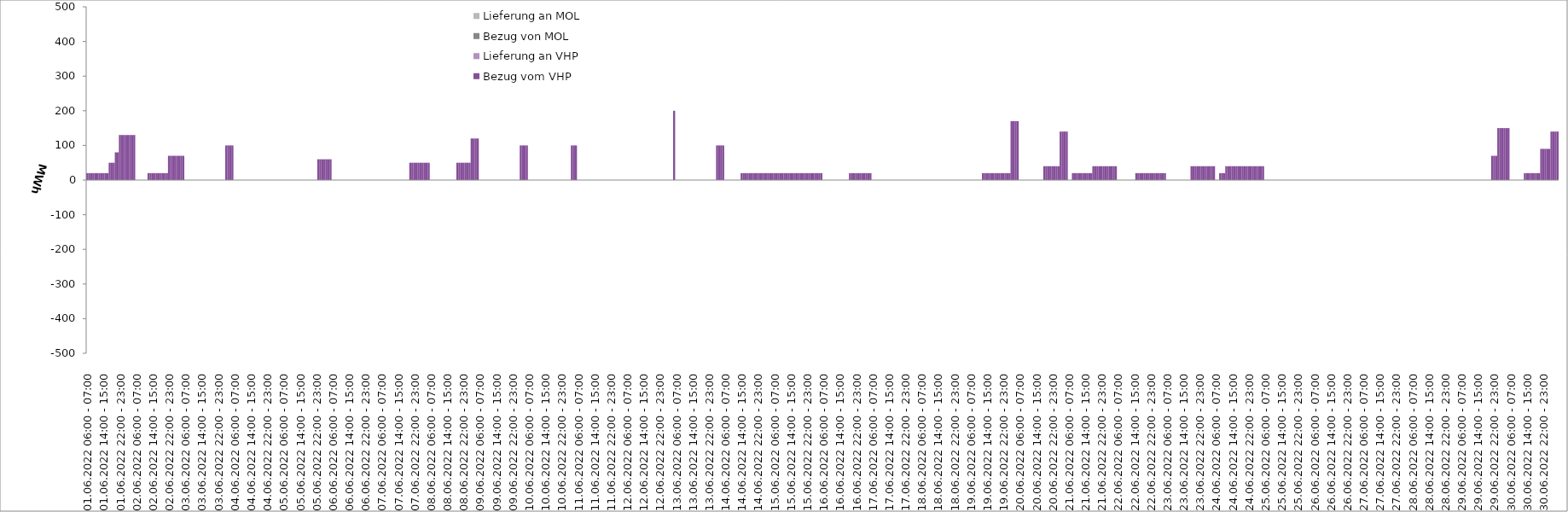
| Category | Bezug vom VHP | Lieferung an VHP | Bezug von MOL | Lieferung an MOL |
|---|---|---|---|---|
| 01.06.2022 06:00 - 07:00 | 20 | 0 | 0 | 0 |
| 01.06.2022 07:00 - 08:00 | 20 | 0 | 0 | 0 |
| 01.06.2022 08:00 - 09:00 | 20 | 0 | 0 | 0 |
| 01.06.2022 09:00 - 10:00 | 20 | 0 | 0 | 0 |
| 01.06.2022 10:00 - 11:00 | 20 | 0 | 0 | 0 |
| 01.06.2022 11:00 - 12:00 | 20 | 0 | 0 | 0 |
| 01.06.2022 12:00 - 13:00 | 20 | 0 | 0 | 0 |
| 01.06.2022 13:00 - 14:00 | 20 | 0 | 0 | 0 |
| 01.06.2022 14:00 - 15:00 | 20 | 0 | 0 | 0 |
| 01.06.2022 15:00 - 16:00 | 20 | 0 | 0 | 0 |
| 01.06.2022 16:00 - 17:00 | 20 | 0 | 0 | 0 |
| 01.06.2022 17:00 - 18:00 | 50 | 0 | 0 | 0 |
| 01.06.2022 18:00 - 19:00 | 50 | 0 | 0 | 0 |
| 01.06.2022 19:00 - 20:00 | 50 | 0 | 0 | 0 |
| 01.06.2022 20:00 - 21:00 | 80 | 0 | 0 | 0 |
| 01.06.2022 21:00 - 22:00 | 80 | 0 | 0 | 0 |
| 01.06.2022 22:00 - 23:00 | 130 | 0 | 0 | 0 |
| 01.06.2022 23:00 - 24:00 | 130 | 0 | 0 | 0 |
| 02.06.2022 00:00 - 01:00 | 130 | 0 | 0 | 0 |
| 02.06.2022 01:00 - 02:00 | 130 | 0 | 0 | 0 |
| 02.06.2022 02:00 - 03:00 | 130 | 0 | 0 | 0 |
| 02.06.2022 03:00 - 04:00 | 130 | 0 | 0 | 0 |
| 02.06.2022 04:00 - 05:00 | 130 | 0 | 0 | 0 |
| 02.06.2022 05:00 - 06:00 | 130 | 0 | 0 | 0 |
| 02.06.2022 06:00 - 07:00 | 0 | 0 | 0 | 0 |
| 02.06.2022 07:00 - 08:00 | 0 | 0 | 0 | 0 |
| 02.06.2022 08:00 - 09:00 | 0 | 0 | 0 | 0 |
| 02.06.2022 09:00 - 10:00 | 0 | 0 | 0 | 0 |
| 02.06.2022 10:00 - 11:00 | 0 | 0 | 0 | 0 |
| 02.06.2022 11:00 - 12:00 | 0 | 0 | 0 | 0 |
| 02.06.2022 12:00 - 13:00 | 20 | 0 | 0 | 0 |
| 02.06.2022 13:00 - 14:00 | 20 | 0 | 0 | 0 |
| 02.06.2022 14:00 - 15:00 | 20 | 0 | 0 | 0 |
| 02.06.2022 15:00 - 16:00 | 20 | 0 | 0 | 0 |
| 02.06.2022 16:00 - 17:00 | 20 | 0 | 0 | 0 |
| 02.06.2022 17:00 - 18:00 | 20 | 0 | 0 | 0 |
| 02.06.2022 18:00 - 19:00 | 20 | 0 | 0 | 0 |
| 02.06.2022 19:00 - 20:00 | 20 | 0 | 0 | 0 |
| 02.06.2022 20:00 - 21:00 | 20 | 0 | 0 | 0 |
| 02.06.2022 21:00 - 22:00 | 20 | 0 | 0 | 0 |
| 02.06.2022 22:00 - 23:00 | 70 | 0 | 0 | 0 |
| 02.06.2022 23:00 - 24:00 | 70 | 0 | 0 | 0 |
| 03.06.2022 00:00 - 01:00 | 70 | 0 | 0 | 0 |
| 03.06.2022 01:00 - 02:00 | 70 | 0 | 0 | 0 |
| 03.06.2022 02:00 - 03:00 | 70 | 0 | 0 | 0 |
| 03.06.2022 03:00 - 04:00 | 70 | 0 | 0 | 0 |
| 03.06.2022 04:00 - 05:00 | 70 | 0 | 0 | 0 |
| 03.06.2022 05:00 - 06:00 | 70 | 0 | 0 | 0 |
| 03.06.2022 06:00 - 07:00 | 0 | 0 | 0 | 0 |
| 03.06.2022 07:00 - 08:00 | 0 | 0 | 0 | 0 |
| 03.06.2022 08:00 - 09:00 | 0 | 0 | 0 | 0 |
| 03.06.2022 09:00 - 10:00 | 0 | 0 | 0 | 0 |
| 03.06.2022 10:00 - 11:00 | 0 | 0 | 0 | 0 |
| 03.06.2022 11:00 - 12:00 | 0 | 0 | 0 | 0 |
| 03.06.2022 12:00 - 13:00 | 0 | 0 | 0 | 0 |
| 03.06.2022 13:00 - 14:00 | 0 | 0 | 0 | 0 |
| 03.06.2022 14:00 - 15:00 | 0 | 0 | 0 | 0 |
| 03.06.2022 15:00 - 16:00 | 0 | 0 | 0 | 0 |
| 03.06.2022 16:00 - 17:00 | 0 | 0 | 0 | 0 |
| 03.06.2022 17:00 - 18:00 | 0 | 0 | 0 | 0 |
| 03.06.2022 18:00 - 19:00 | 0 | 0 | 0 | 0 |
| 03.06.2022 19:00 - 20:00 | 0 | 0 | 0 | 0 |
| 03.06.2022 20:00 - 21:00 | 0 | 0 | 0 | 0 |
| 03.06.2022 21:00 - 22:00 | 0 | 0 | 0 | 0 |
| 03.06.2022 22:00 - 23:00 | 0 | 0 | 0 | 0 |
| 03.06.2022 23:00 - 24:00 | 0 | 0 | 0 | 0 |
| 04.06.2022 00:00 - 01:00 | 0 | 0 | 0 | 0 |
| 04.06.2022 01:00 - 02:00 | 0 | 0 | 0 | 0 |
| 04.06.2022 02:00 - 03:00 | 100 | 0 | 0 | 0 |
| 04.06.2022 03:00 - 04:00 | 100 | 0 | 0 | 0 |
| 04.06.2022 04:00 - 05:00 | 100 | 0 | 0 | 0 |
| 04.06.2022 05:00 - 06:00 | 100 | 0 | 0 | 0 |
| 04.06.2022 06:00 - 07:00 | 0 | 0 | 0 | 0 |
| 04.06.2022 07:00 - 08:00 | 0 | 0 | 0 | 0 |
| 04.06.2022 08:00 - 09:00 | 0 | 0 | 0 | 0 |
| 04.06.2022 09:00 - 10:00 | 0 | 0 | 0 | 0 |
| 04.06.2022 10:00 - 11:00 | 0 | 0 | 0 | 0 |
| 04.06.2022 11:00 - 12:00 | 0 | 0 | 0 | 0 |
| 04.06.2022 12:00 - 13:00 | 0 | 0 | 0 | 0 |
| 04.06.2022 13:00 - 14:00 | 0 | 0 | 0 | 0 |
| 04.06.2022 14:00 - 15:00 | 0 | 0 | 0 | 0 |
| 04.06.2022 15:00 - 16:00 | 0 | 0 | 0 | 0 |
| 04.06.2022 16:00 - 17:00 | 0 | 0 | 0 | 0 |
| 04.06.2022 17:00 - 18:00 | 0 | 0 | 0 | 0 |
| 04.06.2022 18:00 - 19:00 | 0 | 0 | 0 | 0 |
| 04.06.2022 19:00 - 20:00 | 0 | 0 | 0 | 0 |
| 04.06.2022 20:00 - 21:00 | 0 | 0 | 0 | 0 |
| 04.06.2022 21:00 - 22:00 | 0 | 0 | 0 | 0 |
| 04.06.2022 22:00 - 23:00 | 0 | 0 | 0 | 0 |
| 04.06.2022 23:00 - 24:00 | 0 | 0 | 0 | 0 |
| 05.06.2022 00:00 - 01:00 | 0 | 0 | 0 | 0 |
| 05.06.2022 01:00 - 02:00 | 0 | 0 | 0 | 0 |
| 05.06.2022 02:00 - 03:00 | 0 | 0 | 0 | 0 |
| 05.06.2022 03:00 - 04:00 | 0 | 0 | 0 | 0 |
| 05.06.2022 04:00 - 05:00 | 0 | 0 | 0 | 0 |
| 05.06.2022 05:00 - 06:00 | 0 | 0 | 0 | 0 |
| 05.06.2022 06:00 - 07:00 | 0 | 0 | 0 | 0 |
| 05.06.2022 07:00 - 08:00 | 0 | 0 | 0 | 0 |
| 05.06.2022 08:00 - 09:00 | 0 | 0 | 0 | 0 |
| 05.06.2022 09:00 - 10:00 | 0 | 0 | 0 | 0 |
| 05.06.2022 10:00 - 11:00 | 0 | 0 | 0 | 0 |
| 05.06.2022 11:00 - 12:00 | 0 | 0 | 0 | 0 |
| 05.06.2022 12:00 - 13:00 | 0 | 0 | 0 | 0 |
| 05.06.2022 13:00 - 14:00 | 0 | 0 | 0 | 0 |
| 05.06.2022 14:00 - 15:00 | 0 | 0 | 0 | 0 |
| 05.06.2022 15:00 - 16:00 | 0 | 0 | 0 | 0 |
| 05.06.2022 16:00 - 17:00 | 0 | 0 | 0 | 0 |
| 05.06.2022 17:00 - 18:00 | 0 | 0 | 0 | 0 |
| 05.06.2022 18:00 - 19:00 | 0 | 0 | 0 | 0 |
| 05.06.2022 19:00 - 20:00 | 0 | 0 | 0 | 0 |
| 05.06.2022 20:00 - 21:00 | 0 | 0 | 0 | 0 |
| 05.06.2022 21:00 - 22:00 | 0 | 0 | 0 | 0 |
| 05.06.2022 22:00 - 23:00 | 0 | 0 | 0 | 0 |
| 05.06.2022 23:00 - 24:00 | 60 | 0 | 0 | 0 |
| 06.06.2022 00:00 - 01:00 | 60 | 0 | 0 | 0 |
| 06.06.2022 01:00 - 02:00 | 60 | 0 | 0 | 0 |
| 06.06.2022 02:00 - 03:00 | 60 | 0 | 0 | 0 |
| 06.06.2022 03:00 - 04:00 | 60 | 0 | 0 | 0 |
| 06.06.2022 04:00 - 05:00 | 60 | 0 | 0 | 0 |
| 06.06.2022 05:00 - 06:00 | 60 | 0 | 0 | 0 |
| 06.06.2022 06:00 - 07:00 | 0 | 0 | 0 | 0 |
| 06.06.2022 07:00 - 08:00 | 0 | 0 | 0 | 0 |
| 06.06.2022 08:00 - 09:00 | 0 | 0 | 0 | 0 |
| 06.06.2022 09:00 - 10:00 | 0 | 0 | 0 | 0 |
| 06.06.2022 10:00 - 11:00 | 0 | 0 | 0 | 0 |
| 06.06.2022 11:00 - 12:00 | 0 | 0 | 0 | 0 |
| 06.06.2022 12:00 - 13:00 | 0 | 0 | 0 | 0 |
| 06.06.2022 13:00 - 14:00 | 0 | 0 | 0 | 0 |
| 06.06.2022 14:00 - 15:00 | 0 | 0 | 0 | 0 |
| 06.06.2022 15:00 - 16:00 | 0 | 0 | 0 | 0 |
| 06.06.2022 16:00 - 17:00 | 0 | 0 | 0 | 0 |
| 06.06.2022 17:00 - 18:00 | 0 | 0 | 0 | 0 |
| 06.06.2022 18:00 - 19:00 | 0 | 0 | 0 | 0 |
| 06.06.2022 19:00 - 20:00 | 0 | 0 | 0 | 0 |
| 06.06.2022 20:00 - 21:00 | 0 | 0 | 0 | 0 |
| 06.06.2022 21:00 - 22:00 | 0 | 0 | 0 | 0 |
| 06.06.2022 22:00 - 23:00 | 0 | 0 | 0 | 0 |
| 06.06.2022 23:00 - 24:00 | 0 | 0 | 0 | 0 |
| 07.06.2022 00:00 - 01:00 | 0 | 0 | 0 | 0 |
| 07.06.2022 01:00 - 02:00 | 0 | 0 | 0 | 0 |
| 07.06.2022 02:00 - 03:00 | 0 | 0 | 0 | 0 |
| 07.06.2022 03:00 - 04:00 | 0 | 0 | 0 | 0 |
| 07.06.2022 04:00 - 05:00 | 0 | 0 | 0 | 0 |
| 07.06.2022 05:00 - 06:00 | 0 | 0 | 0 | 0 |
| 07.06.2022 06:00 - 07:00 | 0 | 0 | 0 | 0 |
| 07.06.2022 07:00 - 08:00 | 0 | 0 | 0 | 0 |
| 07.06.2022 08:00 - 09:00 | 0 | 0 | 0 | 0 |
| 07.06.2022 09:00 - 10:00 | 0 | 0 | 0 | 0 |
| 07.06.2022 10:00 - 11:00 | 0 | 0 | 0 | 0 |
| 07.06.2022 11:00 - 12:00 | 0 | 0 | 0 | 0 |
| 07.06.2022 12:00 - 13:00 | 0 | 0 | 0 | 0 |
| 07.06.2022 13:00 - 14:00 | 0 | 0 | 0 | 0 |
| 07.06.2022 14:00 - 15:00 | 0 | 0 | 0 | 0 |
| 07.06.2022 15:00 - 16:00 | 0 | 0 | 0 | 0 |
| 07.06.2022 16:00 - 17:00 | 0 | 0 | 0 | 0 |
| 07.06.2022 17:00 - 18:00 | 0 | 0 | 0 | 0 |
| 07.06.2022 18:00 - 19:00 | 0 | 0 | 0 | 0 |
| 07.06.2022 19:00 - 20:00 | 0 | 0 | 0 | 0 |
| 07.06.2022 20:00 - 21:00 | 50 | 0 | 0 | 0 |
| 07.06.2022 21:00 - 22:00 | 50 | 0 | 0 | 0 |
| 07.06.2022 22:00 - 23:00 | 50 | 0 | 0 | 0 |
| 07.06.2022 23:00 - 24:00 | 50 | 0 | 0 | 0 |
| 08.06.2022 00:00 - 01:00 | 50 | 0 | 0 | 0 |
| 08.06.2022 01:00 - 02:00 | 50 | 0 | 0 | 0 |
| 08.06.2022 02:00 - 03:00 | 50 | 0 | 0 | 0 |
| 08.06.2022 03:00 - 04:00 | 50 | 0 | 0 | 0 |
| 08.06.2022 04:00 - 05:00 | 50 | 0 | 0 | 0 |
| 08.06.2022 05:00 - 06:00 | 50 | 0 | 0 | 0 |
| 08.06.2022 06:00 - 07:00 | 0 | 0 | 0 | 0 |
| 08.06.2022 07:00 - 08:00 | 0 | 0 | 0 | 0 |
| 08.06.2022 08:00 - 09:00 | 0 | 0 | 0 | 0 |
| 08.06.2022 09:00 - 10:00 | 0 | 0 | 0 | 0 |
| 08.06.2022 10:00 - 11:00 | 0 | 0 | 0 | 0 |
| 08.06.2022 11:00 - 12:00 | 0 | 0 | 0 | 0 |
| 08.06.2022 12:00 - 13:00 | 0 | 0 | 0 | 0 |
| 08.06.2022 13:00 - 14:00 | 0 | 0 | 0 | 0 |
| 08.06.2022 14:00 - 15:00 | 0 | 0 | 0 | 0 |
| 08.06.2022 15:00 - 16:00 | 0 | 0 | 0 | 0 |
| 08.06.2022 16:00 - 17:00 | 0 | 0 | 0 | 0 |
| 08.06.2022 17:00 - 18:00 | 0 | 0 | 0 | 0 |
| 08.06.2022 18:00 - 19:00 | 0 | 0 | 0 | 0 |
| 08.06.2022 19:00 - 20:00 | 50 | 0 | 0 | 0 |
| 08.06.2022 20:00 - 21:00 | 50 | 0 | 0 | 0 |
| 08.06.2022 21:00 - 22:00 | 50 | 0 | 0 | 0 |
| 08.06.2022 22:00 - 23:00 | 50 | 0 | 0 | 0 |
| 08.06.2022 23:00 - 24:00 | 50 | 0 | 0 | 0 |
| 09.06.2022 00:00 - 01:00 | 50 | 0 | 0 | 0 |
| 09.06.2022 01:00 - 02:00 | 50 | 0 | 0 | 0 |
| 09.06.2022 02:00 - 03:00 | 120 | 0 | 0 | 0 |
| 09.06.2022 03:00 - 04:00 | 120 | 0 | 0 | 0 |
| 09.06.2022 04:00 - 05:00 | 120 | 0 | 0 | 0 |
| 09.06.2022 05:00 - 06:00 | 120 | 0 | 0 | 0 |
| 09.06.2022 06:00 - 07:00 | 0 | 0 | 0 | 0 |
| 09.06.2022 07:00 - 08:00 | 0 | 0 | 0 | 0 |
| 09.06.2022 08:00 - 09:00 | 0 | 0 | 0 | 0 |
| 09.06.2022 09:00 - 10:00 | 0 | 0 | 0 | 0 |
| 09.06.2022 10:00 - 11:00 | 0 | 0 | 0 | 0 |
| 09.06.2022 11:00 - 12:00 | 0 | 0 | 0 | 0 |
| 09.06.2022 12:00 - 13:00 | 0 | 0 | 0 | 0 |
| 09.06.2022 13:00 - 14:00 | 0 | 0 | 0 | 0 |
| 09.06.2022 14:00 - 15:00 | 0 | 0 | 0 | 0 |
| 09.06.2022 15:00 - 16:00 | 0 | 0 | 0 | 0 |
| 09.06.2022 16:00 - 17:00 | 0 | 0 | 0 | 0 |
| 09.06.2022 17:00 - 18:00 | 0 | 0 | 0 | 0 |
| 09.06.2022 18:00 - 19:00 | 0 | 0 | 0 | 0 |
| 09.06.2022 19:00 - 20:00 | 0 | 0 | 0 | 0 |
| 09.06.2022 20:00 - 21:00 | 0 | 0 | 0 | 0 |
| 09.06.2022 21:00 - 22:00 | 0 | 0 | 0 | 0 |
| 09.06.2022 22:00 - 23:00 | 0 | 0 | 0 | 0 |
| 09.06.2022 23:00 - 24:00 | 0 | 0 | 0 | 0 |
| 10.06.2022 00:00 - 01:00 | 0 | 0 | 0 | 0 |
| 10.06.2022 01:00 - 02:00 | 0 | 0 | 0 | 0 |
| 10.06.2022 02:00 - 03:00 | 100 | 0 | 0 | 0 |
| 10.06.2022 03:00 - 04:00 | 100 | 0 | 0 | 0 |
| 10.06.2022 04:00 - 05:00 | 100 | 0 | 0 | 0 |
| 10.06.2022 05:00 - 06:00 | 100 | 0 | 0 | 0 |
| 10.06.2022 06:00 - 07:00 | 0 | 0 | 0 | 0 |
| 10.06.2022 07:00 - 08:00 | 0 | 0 | 0 | 0 |
| 10.06.2022 08:00 - 09:00 | 0 | 0 | 0 | 0 |
| 10.06.2022 09:00 - 10:00 | 0 | 0 | 0 | 0 |
| 10.06.2022 10:00 - 11:00 | 0 | 0 | 0 | 0 |
| 10.06.2022 11:00 - 12:00 | 0 | 0 | 0 | 0 |
| 10.06.2022 12:00 - 13:00 | 0 | 0 | 0 | 0 |
| 10.06.2022 13:00 - 14:00 | 0 | 0 | 0 | 0 |
| 10.06.2022 14:00 - 15:00 | 0 | 0 | 0 | 0 |
| 10.06.2022 15:00 - 16:00 | 0 | 0 | 0 | 0 |
| 10.06.2022 16:00 - 17:00 | 0 | 0 | 0 | 0 |
| 10.06.2022 17:00 - 18:00 | 0 | 0 | 0 | 0 |
| 10.06.2022 18:00 - 19:00 | 0 | 0 | 0 | 0 |
| 10.06.2022 19:00 - 20:00 | 0 | 0 | 0 | 0 |
| 10.06.2022 20:00 - 21:00 | 0 | 0 | 0 | 0 |
| 10.06.2022 21:00 - 22:00 | 0 | 0 | 0 | 0 |
| 10.06.2022 22:00 - 23:00 | 0 | 0 | 0 | 0 |
| 10.06.2022 23:00 - 24:00 | 0 | 0 | 0 | 0 |
| 11.06.2022 00:00 - 01:00 | 0 | 0 | 0 | 0 |
| 11.06.2022 01:00 - 02:00 | 0 | 0 | 0 | 0 |
| 11.06.2022 02:00 - 03:00 | 0 | 0 | 0 | 0 |
| 11.06.2022 03:00 - 04:00 | 100 | 0 | 0 | 0 |
| 11.06.2022 04:00 - 05:00 | 100 | 0 | 0 | 0 |
| 11.06.2022 05:00 - 06:00 | 100 | 0 | 0 | 0 |
| 11.06.2022 06:00 - 07:00 | 0 | 0 | 0 | 0 |
| 11.06.2022 07:00 - 08:00 | 0 | 0 | 0 | 0 |
| 11.06.2022 08:00 - 09:00 | 0 | 0 | 0 | 0 |
| 11.06.2022 09:00 - 10:00 | 0 | 0 | 0 | 0 |
| 11.06.2022 10:00 - 11:00 | 0 | 0 | 0 | 0 |
| 11.06.2022 11:00 - 12:00 | 0 | 0 | 0 | 0 |
| 11.06.2022 12:00 - 13:00 | 0 | 0 | 0 | 0 |
| 11.06.2022 13:00 - 14:00 | 0 | 0 | 0 | 0 |
| 11.06.2022 14:00 - 15:00 | 0 | 0 | 0 | 0 |
| 11.06.2022 15:00 - 16:00 | 0 | 0 | 0 | 0 |
| 11.06.2022 16:00 - 17:00 | 0 | 0 | 0 | 0 |
| 11.06.2022 17:00 - 18:00 | 0 | 0 | 0 | 0 |
| 11.06.2022 18:00 - 19:00 | 0 | 0 | 0 | 0 |
| 11.06.2022 19:00 - 20:00 | 0 | 0 | 0 | 0 |
| 11.06.2022 20:00 - 21:00 | 0 | 0 | 0 | 0 |
| 11.06.2022 21:00 - 22:00 | 0 | 0 | 0 | 0 |
| 11.06.2022 22:00 - 23:00 | 0 | 0 | 0 | 0 |
| 11.06.2022 23:00 - 24:00 | 0 | 0 | 0 | 0 |
| 12.06.2022 00:00 - 01:00 | 0 | 0 | 0 | 0 |
| 12.06.2022 01:00 - 02:00 | 0 | 0 | 0 | 0 |
| 12.06.2022 02:00 - 03:00 | 0 | 0 | 0 | 0 |
| 12.06.2022 03:00 - 04:00 | 0 | 0 | 0 | 0 |
| 12.06.2022 04:00 - 05:00 | 0 | 0 | 0 | 0 |
| 12.06.2022 05:00 - 06:00 | 0 | 0 | 0 | 0 |
| 12.06.2022 06:00 - 07:00 | 0 | 0 | 0 | 0 |
| 12.06.2022 07:00 - 08:00 | 0 | 0 | 0 | 0 |
| 12.06.2022 08:00 - 09:00 | 0 | 0 | 0 | 0 |
| 12.06.2022 09:00 - 10:00 | 0 | 0 | 0 | 0 |
| 12.06.2022 10:00 - 11:00 | 0 | 0 | 0 | 0 |
| 12.06.2022 11:00 - 12:00 | 0 | 0 | 0 | 0 |
| 12.06.2022 12:00 - 13:00 | 0 | 0 | 0 | 0 |
| 12.06.2022 13:00 - 14:00 | 0 | 0 | 0 | 0 |
| 12.06.2022 14:00 - 15:00 | 0 | 0 | 0 | 0 |
| 12.06.2022 15:00 - 16:00 | 0 | 0 | 0 | 0 |
| 12.06.2022 16:00 - 17:00 | 0 | 0 | 0 | 0 |
| 12.06.2022 17:00 - 18:00 | 0 | 0 | 0 | 0 |
| 12.06.2022 18:00 - 19:00 | 0 | 0 | 0 | 0 |
| 12.06.2022 19:00 - 20:00 | 0 | 0 | 0 | 0 |
| 12.06.2022 20:00 - 21:00 | 0 | 0 | 0 | 0 |
| 12.06.2022 21:00 - 22:00 | 0 | 0 | 0 | 0 |
| 12.06.2022 22:00 - 23:00 | 0 | 0 | 0 | 0 |
| 12.06.2022 23:00 - 24:00 | 0 | 0 | 0 | 0 |
| 13.06.2022 00:00 - 01:00 | 0 | 0 | 0 | 0 |
| 13.06.2022 01:00 - 02:00 | 0 | 0 | 0 | 0 |
| 13.06.2022 02:00 - 03:00 | 0 | 0 | 0 | 0 |
| 13.06.2022 03:00 - 04:00 | 0 | 0 | 0 | 0 |
| 13.06.2022 04:00 - 05:00 | 0 | 0 | 0 | 0 |
| 13.06.2022 05:00 - 06:00 | 200 | 0 | 0 | 0 |
| 13.06.2022 06:00 - 07:00 | 0 | 0 | 0 | 0 |
| 13.06.2022 07:00 - 08:00 | 0 | 0 | 0 | 0 |
| 13.06.2022 08:00 - 09:00 | 0 | 0 | 0 | 0 |
| 13.06.2022 09:00 - 10:00 | 0 | 0 | 0 | 0 |
| 13.06.2022 10:00 - 11:00 | 0 | 0 | 0 | 0 |
| 13.06.2022 11:00 - 12:00 | 0 | 0 | 0 | 0 |
| 13.06.2022 12:00 - 13:00 | 0 | 0 | 0 | 0 |
| 13.06.2022 13:00 - 14:00 | 0 | 0 | 0 | 0 |
| 13.06.2022 14:00 - 15:00 | 0 | 0 | 0 | 0 |
| 13.06.2022 15:00 - 16:00 | 0 | 0 | 0 | 0 |
| 13.06.2022 16:00 - 17:00 | 0 | 0 | 0 | 0 |
| 13.06.2022 17:00 - 18:00 | 0 | 0 | 0 | 0 |
| 13.06.2022 18:00 - 19:00 | 0 | 0 | 0 | 0 |
| 13.06.2022 19:00 - 20:00 | 0 | 0 | 0 | 0 |
| 13.06.2022 20:00 - 21:00 | 0 | 0 | 0 | 0 |
| 13.06.2022 21:00 - 22:00 | 0 | 0 | 0 | 0 |
| 13.06.2022 22:00 - 23:00 | 0 | 0 | 0 | 0 |
| 13.06.2022 23:00 - 24:00 | 0 | 0 | 0 | 0 |
| 14.06.2022 00:00 - 01:00 | 0 | 0 | 0 | 0 |
| 14.06.2022 01:00 - 02:00 | 0 | 0 | 0 | 0 |
| 14.06.2022 02:00 - 03:00 | 100 | 0 | 0 | 0 |
| 14.06.2022 03:00 - 04:00 | 100 | 0 | 0 | 0 |
| 14.06.2022 04:00 - 05:00 | 100 | 0 | 0 | 0 |
| 14.06.2022 05:00 - 06:00 | 100 | 0 | 0 | 0 |
| 14.06.2022 06:00 - 07:00 | 0 | 0 | 0 | 0 |
| 14.06.2022 07:00 - 08:00 | 0 | 0 | 0 | 0 |
| 14.06.2022 08:00 - 09:00 | 0 | 0 | 0 | 0 |
| 14.06.2022 09:00 - 10:00 | 0 | 0 | 0 | 0 |
| 14.06.2022 10:00 - 11:00 | 0 | 0 | 0 | 0 |
| 14.06.2022 11:00 - 12:00 | 0 | 0 | 0 | 0 |
| 14.06.2022 12:00 - 13:00 | 0 | 0 | 0 | 0 |
| 14.06.2022 13:00 - 14:00 | 0 | 0 | 0 | 0 |
| 14.06.2022 14:00 - 15:00 | 20 | 0 | 0 | 0 |
| 14.06.2022 15:00 - 16:00 | 20 | 0 | 0 | 0 |
| 14.06.2022 16:00 - 17:00 | 20 | 0 | 0 | 0 |
| 14.06.2022 17:00 - 18:00 | 20 | 0 | 0 | 0 |
| 14.06.2022 18:00 - 19:00 | 20 | 0 | 0 | 0 |
| 14.06.2022 19:00 - 20:00 | 20 | 0 | 0 | 0 |
| 14.06.2022 20:00 - 21:00 | 20 | 0 | 0 | 0 |
| 14.06.2022 21:00 - 22:00 | 20 | 0 | 0 | 0 |
| 14.06.2022 22:00 - 23:00 | 20 | 0 | 0 | 0 |
| 14.06.2022 23:00 - 24:00 | 20 | 0 | 0 | 0 |
| 15.06.2022 00:00 - 01:00 | 20 | 0 | 0 | 0 |
| 15.06.2022 01:00 - 02:00 | 20 | 0 | 0 | 0 |
| 15.06.2022 02:00 - 03:00 | 20 | 0 | 0 | 0 |
| 15.06.2022 03:00 - 04:00 | 20 | 0 | 0 | 0 |
| 15.06.2022 04:00 - 05:00 | 20 | 0 | 0 | 0 |
| 15.06.2022 05:00 - 06:00 | 20 | 0 | 0 | 0 |
| 15.06.2022 06:00 - 07:00 | 20 | 0 | 0 | 0 |
| 15.06.2022 07:00 - 08:00 | 20 | 0 | 0 | 0 |
| 15.06.2022 08:00 - 09:00 | 20 | 0 | 0 | 0 |
| 15.06.2022 09:00 - 10:00 | 20 | 0 | 0 | 0 |
| 15.06.2022 10:00 - 11:00 | 20 | 0 | 0 | 0 |
| 15.06.2022 11:00 - 12:00 | 20 | 0 | 0 | 0 |
| 15.06.2022 12:00 - 13:00 | 20 | 0 | 0 | 0 |
| 15.06.2022 13:00 - 14:00 | 20 | 0 | 0 | 0 |
| 15.06.2022 14:00 - 15:00 | 20 | 0 | 0 | 0 |
| 15.06.2022 15:00 - 16:00 | 20 | 0 | 0 | 0 |
| 15.06.2022 16:00 - 17:00 | 20 | 0 | 0 | 0 |
| 15.06.2022 17:00 - 18:00 | 20 | 0 | 0 | 0 |
| 15.06.2022 18:00 - 19:00 | 20 | 0 | 0 | 0 |
| 15.06.2022 19:00 - 20:00 | 20 | 0 | 0 | 0 |
| 15.06.2022 20:00 - 21:00 | 20 | 0 | 0 | 0 |
| 15.06.2022 21:00 - 22:00 | 20 | 0 | 0 | 0 |
| 15.06.2022 22:00 - 23:00 | 20 | 0 | 0 | 0 |
| 15.06.2022 23:00 - 24:00 | 20 | 0 | 0 | 0 |
| 16.06.2022 00:00 - 01:00 | 20 | 0 | 0 | 0 |
| 16.06.2022 01:00 - 02:00 | 20 | 0 | 0 | 0 |
| 16.06.2022 02:00 - 03:00 | 20 | 0 | 0 | 0 |
| 16.06.2022 03:00 - 04:00 | 20 | 0 | 0 | 0 |
| 16.06.2022 04:00 - 05:00 | 20 | 0 | 0 | 0 |
| 16.06.2022 05:00 - 06:00 | 20 | 0 | 0 | 0 |
| 16.06.2022 06:00 - 07:00 | 0 | 0 | 0 | 0 |
| 16.06.2022 07:00 - 08:00 | 0 | 0 | 0 | 0 |
| 16.06.2022 08:00 - 09:00 | 0 | 0 | 0 | 0 |
| 16.06.2022 09:00 - 10:00 | 0 | 0 | 0 | 0 |
| 16.06.2022 10:00 - 11:00 | 0 | 0 | 0 | 0 |
| 16.06.2022 11:00 - 12:00 | 0 | 0 | 0 | 0 |
| 16.06.2022 12:00 - 13:00 | 0 | 0 | 0 | 0 |
| 16.06.2022 13:00 - 14:00 | 0 | 0 | 0 | 0 |
| 16.06.2022 14:00 - 15:00 | 0 | 0 | 0 | 0 |
| 16.06.2022 15:00 - 16:00 | 0 | 0 | 0 | 0 |
| 16.06.2022 16:00 - 17:00 | 0 | 0 | 0 | 0 |
| 16.06.2022 17:00 - 18:00 | 0 | 0 | 0 | 0 |
| 16.06.2022 18:00 - 19:00 | 0 | 0 | 0 | 0 |
| 16.06.2022 19:00 - 20:00 | 20 | 0 | 0 | 0 |
| 16.06.2022 20:00 - 21:00 | 20 | 0 | 0 | 0 |
| 16.06.2022 21:00 - 22:00 | 20 | 0 | 0 | 0 |
| 16.06.2022 22:00 - 23:00 | 20 | 0 | 0 | 0 |
| 16.06.2022 23:00 - 24:00 | 20 | 0 | 0 | 0 |
| 17.06.2022 00:00 - 01:00 | 20 | 0 | 0 | 0 |
| 17.06.2022 01:00 - 02:00 | 20 | 0 | 0 | 0 |
| 17.06.2022 02:00 - 03:00 | 20 | 0 | 0 | 0 |
| 17.06.2022 03:00 - 04:00 | 20 | 0 | 0 | 0 |
| 17.06.2022 04:00 - 05:00 | 20 | 0 | 0 | 0 |
| 17.06.2022 05:00 - 06:00 | 20 | 0 | 0 | 0 |
| 17.06.2022 06:00 - 07:00 | 0 | 0 | 0 | 0 |
| 17.06.2022 07:00 - 08:00 | 0 | 0 | 0 | 0 |
| 17.06.2022 08:00 - 09:00 | 0 | 0 | 0 | 0 |
| 17.06.2022 09:00 - 10:00 | 0 | 0 | 0 | 0 |
| 17.06.2022 10:00 - 11:00 | 0 | 0 | 0 | 0 |
| 17.06.2022 11:00 - 12:00 | 0 | 0 | 0 | 0 |
| 17.06.2022 12:00 - 13:00 | 0 | 0 | 0 | 0 |
| 17.06.2022 13:00 - 14:00 | 0 | 0 | 0 | 0 |
| 17.06.2022 14:00 - 15:00 | 0 | 0 | 0 | 0 |
| 17.06.2022 15:00 - 16:00 | 0 | 0 | 0 | 0 |
| 17.06.2022 16:00 - 17:00 | 0 | 0 | 0 | 0 |
| 17.06.2022 17:00 - 18:00 | 0 | 0 | 0 | 0 |
| 17.06.2022 18:00 - 19:00 | 0 | 0 | 0 | 0 |
| 17.06.2022 19:00 - 20:00 | 0 | 0 | 0 | 0 |
| 17.06.2022 20:00 - 21:00 | 0 | 0 | 0 | 0 |
| 17.06.2022 21:00 - 22:00 | 0 | 0 | 0 | 0 |
| 17.06.2022 22:00 - 23:00 | 0 | 0 | 0 | 0 |
| 17.06.2022 23:00 - 24:00 | 0 | 0 | 0 | 0 |
| 18.06.2022 00:00 - 01:00 | 0 | 0 | 0 | 0 |
| 18.06.2022 01:00 - 02:00 | 0 | 0 | 0 | 0 |
| 18.06.2022 02:00 - 03:00 | 0 | 0 | 0 | 0 |
| 18.06.2022 03:00 - 04:00 | 0 | 0 | 0 | 0 |
| 18.06.2022 04:00 - 05:00 | 0 | 0 | 0 | 0 |
| 18.06.2022 05:00 - 06:00 | 0 | 0 | 0 | 0 |
| 18.06.2022 06:00 - 07:00 | 0 | 0 | 0 | 0 |
| 18.06.2022 07:00 - 08:00 | 0 | 0 | 0 | 0 |
| 18.06.2022 08:00 - 09:00 | 0 | 0 | 0 | 0 |
| 18.06.2022 09:00 - 10:00 | 0 | 0 | 0 | 0 |
| 18.06.2022 10:00 - 11:00 | 0 | 0 | 0 | 0 |
| 18.06.2022 11:00 - 12:00 | 0 | 0 | 0 | 0 |
| 18.06.2022 12:00 - 13:00 | 0 | 0 | 0 | 0 |
| 18.06.2022 13:00 - 14:00 | 0 | 0 | 0 | 0 |
| 18.06.2022 14:00 - 15:00 | 0 | 0 | 0 | 0 |
| 18.06.2022 15:00 - 16:00 | 0 | 0 | 0 | 0 |
| 18.06.2022 16:00 - 17:00 | 0 | 0 | 0 | 0 |
| 18.06.2022 17:00 - 18:00 | 0 | 0 | 0 | 0 |
| 18.06.2022 18:00 - 19:00 | 0 | 0 | 0 | 0 |
| 18.06.2022 19:00 - 20:00 | 0 | 0 | 0 | 0 |
| 18.06.2022 20:00 - 21:00 | 0 | 0 | 0 | 0 |
| 18.06.2022 21:00 - 22:00 | 0 | 0 | 0 | 0 |
| 18.06.2022 22:00 - 23:00 | 0 | 0 | 0 | 0 |
| 18.06.2022 23:00 - 24:00 | 0 | 0 | 0 | 0 |
| 19.06.2022 00:00 - 01:00 | 0 | 0 | 0 | 0 |
| 19.06.2022 01:00 - 02:00 | 0 | 0 | 0 | 0 |
| 19.06.2022 02:00 - 03:00 | 0 | 0 | 0 | 0 |
| 19.06.2022 03:00 - 04:00 | 0 | 0 | 0 | 0 |
| 19.06.2022 04:00 - 05:00 | 0 | 0 | 0 | 0 |
| 19.06.2022 05:00 - 06:00 | 0 | 0 | 0 | 0 |
| 19.06.2022 06:00 - 07:00 | 0 | 0 | 0 | 0 |
| 19.06.2022 07:00 - 08:00 | 0 | 0 | 0 | 0 |
| 19.06.2022 08:00 - 09:00 | 0 | 0 | 0 | 0 |
| 19.06.2022 09:00 - 10:00 | 0 | 0 | 0 | 0 |
| 19.06.2022 10:00 - 11:00 | 0 | 0 | 0 | 0 |
| 19.06.2022 11:00 - 12:00 | 0 | 0 | 0 | 0 |
| 19.06.2022 12:00 - 13:00 | 20 | 0 | 0 | 0 |
| 19.06.2022 13:00 - 14:00 | 20 | 0 | 0 | 0 |
| 19.06.2022 14:00 - 15:00 | 20 | 0 | 0 | 0 |
| 19.06.2022 15:00 - 16:00 | 20 | 0 | 0 | 0 |
| 19.06.2022 16:00 - 17:00 | 20 | 0 | 0 | 0 |
| 19.06.2022 17:00 - 18:00 | 20 | 0 | 0 | 0 |
| 19.06.2022 18:00 - 19:00 | 20 | 0 | 0 | 0 |
| 19.06.2022 19:00 - 20:00 | 20 | 0 | 0 | 0 |
| 19.06.2022 20:00 - 21:00 | 20 | 0 | 0 | 0 |
| 19.06.2022 21:00 - 22:00 | 20 | 0 | 0 | 0 |
| 19.06.2022 22:00 - 23:00 | 20 | 0 | 0 | 0 |
| 19.06.2022 23:00 - 24:00 | 20 | 0 | 0 | 0 |
| 20.06.2022 00:00 - 01:00 | 20 | 0 | 0 | 0 |
| 20.06.2022 01:00 - 02:00 | 20 | 0 | 0 | 0 |
| 20.06.2022 02:00 - 03:00 | 170 | 0 | 0 | 0 |
| 20.06.2022 03:00 - 04:00 | 170 | 0 | 0 | 0 |
| 20.06.2022 04:00 - 05:00 | 170 | 0 | 0 | 0 |
| 20.06.2022 05:00 - 06:00 | 170 | 0 | 0 | 0 |
| 20.06.2022 06:00 - 07:00 | 0 | 0 | 0 | 0 |
| 20.06.2022 07:00 - 08:00 | 0 | 0 | 0 | 0 |
| 20.06.2022 08:00 - 09:00 | 0 | 0 | 0 | 0 |
| 20.06.2022 09:00 - 10:00 | 0 | 0 | 0 | 0 |
| 20.06.2022 10:00 - 11:00 | 0 | 0 | 0 | 0 |
| 20.06.2022 11:00 - 12:00 | 0 | 0 | 0 | 0 |
| 20.06.2022 12:00 - 13:00 | 0 | 0 | 0 | 0 |
| 20.06.2022 13:00 - 14:00 | 0 | 0 | 0 | 0 |
| 20.06.2022 14:00 - 15:00 | 0 | 0 | 0 | 0 |
| 20.06.2022 15:00 - 16:00 | 0 | 0 | 0 | 0 |
| 20.06.2022 16:00 - 17:00 | 0 | 0 | 0 | 0 |
| 20.06.2022 17:00 - 18:00 | 0 | 0 | 0 | 0 |
| 20.06.2022 18:00 - 19:00 | 40 | 0 | 0 | 0 |
| 20.06.2022 19:00 - 20:00 | 40 | 0 | 0 | 0 |
| 20.06.2022 20:00 - 21:00 | 40 | 0 | 0 | 0 |
| 20.06.2022 21:00 - 22:00 | 40 | 0 | 0 | 0 |
| 20.06.2022 22:00 - 23:00 | 40 | 0 | 0 | 0 |
| 20.06.2022 23:00 - 24:00 | 40 | 0 | 0 | 0 |
| 21.06.2022 00:00 - 01:00 | 40 | 0 | 0 | 0 |
| 21.06.2022 01:00 - 02:00 | 40 | 0 | 0 | 0 |
| 21.06.2022 02:00 - 03:00 | 140 | 0 | 0 | 0 |
| 21.06.2022 03:00 - 04:00 | 140 | 0 | 0 | 0 |
| 21.06.2022 04:00 - 05:00 | 140 | 0 | 0 | 0 |
| 21.06.2022 05:00 - 06:00 | 140 | 0 | 0 | 0 |
| 21.06.2022 06:00 - 07:00 | 0 | 0 | 0 | 0 |
| 21.06.2022 07:00 - 08:00 | 0 | 0 | 0 | 0 |
| 21.06.2022 08:00 - 09:00 | 20 | 0 | 0 | 0 |
| 21.06.2022 09:00 - 10:00 | 20 | 0 | 0 | 0 |
| 21.06.2022 10:00 - 11:00 | 20 | 0 | 0 | 0 |
| 21.06.2022 11:00 - 12:00 | 20 | 0 | 0 | 0 |
| 21.06.2022 12:00 - 13:00 | 20 | 0 | 0 | 0 |
| 21.06.2022 13:00 - 14:00 | 20 | 0 | 0 | 0 |
| 21.06.2022 14:00 - 15:00 | 20 | 0 | 0 | 0 |
| 21.06.2022 15:00 - 16:00 | 20 | 0 | 0 | 0 |
| 21.06.2022 16:00 - 17:00 | 20 | 0 | 0 | 0 |
| 21.06.2022 17:00 - 18:00 | 20 | 0 | 0 | 0 |
| 21.06.2022 18:00 - 19:00 | 40 | 0 | 0 | 0 |
| 21.06.2022 19:00 - 20:00 | 40 | 0 | 0 | 0 |
| 21.06.2022 20:00 - 21:00 | 40 | 0 | 0 | 0 |
| 21.06.2022 21:00 - 22:00 | 40 | 0 | 0 | 0 |
| 21.06.2022 22:00 - 23:00 | 40 | 0 | 0 | 0 |
| 21.06.2022 23:00 - 24:00 | 40 | 0 | 0 | 0 |
| 22.06.2022 00:00 - 01:00 | 40 | 0 | 0 | 0 |
| 22.06.2022 01:00 - 02:00 | 40 | 0 | 0 | 0 |
| 22.06.2022 02:00 - 03:00 | 40 | 0 | 0 | 0 |
| 22.06.2022 03:00 - 04:00 | 40 | 0 | 0 | 0 |
| 22.06.2022 04:00 - 05:00 | 40 | 0 | 0 | 0 |
| 22.06.2022 05:00 - 06:00 | 40 | 0 | 0 | 0 |
| 22.06.2022 06:00 - 07:00 | 0 | 0 | 0 | 0 |
| 22.06.2022 07:00 - 08:00 | 0 | 0 | 0 | 0 |
| 22.06.2022 08:00 - 09:00 | 0 | 0 | 0 | 0 |
| 22.06.2022 09:00 - 10:00 | 0 | 0 | 0 | 0 |
| 22.06.2022 10:00 - 11:00 | 0 | 0 | 0 | 0 |
| 22.06.2022 11:00 - 12:00 | 0 | 0 | 0 | 0 |
| 22.06.2022 12:00 - 13:00 | 0 | 0 | 0 | 0 |
| 22.06.2022 13:00 - 14:00 | 0 | 0 | 0 | 0 |
| 22.06.2022 14:00 - 15:00 | 0 | 0 | 0 | 0 |
| 22.06.2022 15:00 - 16:00 | 20 | 0 | 0 | 0 |
| 22.06.2022 16:00 - 17:00 | 20 | 0 | 0 | 0 |
| 22.06.2022 17:00 - 18:00 | 20 | 0 | 0 | 0 |
| 22.06.2022 18:00 - 19:00 | 20 | 0 | 0 | 0 |
| 22.06.2022 19:00 - 20:00 | 20 | 0 | 0 | 0 |
| 22.06.2022 20:00 - 21:00 | 20 | 0 | 0 | 0 |
| 22.06.2022 21:00 - 22:00 | 20 | 0 | 0 | 0 |
| 22.06.2022 22:00 - 23:00 | 20 | 0 | 0 | 0 |
| 22.06.2022 23:00 - 24:00 | 20 | 0 | 0 | 0 |
| 23.06.2022 00:00 - 01:00 | 20 | 0 | 0 | 0 |
| 23.06.2022 01:00 - 02:00 | 20 | 0 | 0 | 0 |
| 23.06.2022 02:00 - 03:00 | 20 | 0 | 0 | 0 |
| 23.06.2022 03:00 - 04:00 | 20 | 0 | 0 | 0 |
| 23.06.2022 04:00 - 05:00 | 20 | 0 | 0 | 0 |
| 23.06.2022 05:00 - 06:00 | 20 | 0 | 0 | 0 |
| 23.06.2022 06:00 - 07:00 | 0 | 0 | 0 | 0 |
| 23.06.2022 07:00 - 08:00 | 0 | 0 | 0 | 0 |
| 23.06.2022 08:00 - 09:00 | 0 | 0 | 0 | 0 |
| 23.06.2022 09:00 - 10:00 | 0 | 0 | 0 | 0 |
| 23.06.2022 10:00 - 11:00 | 0 | 0 | 0 | 0 |
| 23.06.2022 11:00 - 12:00 | 0 | 0 | 0 | 0 |
| 23.06.2022 12:00 - 13:00 | 0 | 0 | 0 | 0 |
| 23.06.2022 13:00 - 14:00 | 0 | 0 | 0 | 0 |
| 23.06.2022 14:00 - 15:00 | 0 | 0 | 0 | 0 |
| 23.06.2022 15:00 - 16:00 | 0 | 0 | 0 | 0 |
| 23.06.2022 16:00 - 17:00 | 0 | 0 | 0 | 0 |
| 23.06.2022 17:00 - 18:00 | 0 | 0 | 0 | 0 |
| 23.06.2022 18:00 - 19:00 | 40 | 0 | 0 | 0 |
| 23.06.2022 19:00 - 20:00 | 40 | 0 | 0 | 0 |
| 23.06.2022 20:00 - 21:00 | 40 | 0 | 0 | 0 |
| 23.06.2022 21:00 - 22:00 | 40 | 0 | 0 | 0 |
| 23.06.2022 22:00 - 23:00 | 40 | 0 | 0 | 0 |
| 23.06.2022 23:00 - 24:00 | 40 | 0 | 0 | 0 |
| 24.06.2022 00:00 - 01:00 | 40 | 0 | 0 | 0 |
| 24.06.2022 01:00 - 02:00 | 40 | 0 | 0 | 0 |
| 24.06.2022 02:00 - 03:00 | 40 | 0 | 0 | 0 |
| 24.06.2022 03:00 - 04:00 | 40 | 0 | 0 | 0 |
| 24.06.2022 04:00 - 05:00 | 40 | 0 | 0 | 0 |
| 24.06.2022 05:00 - 06:00 | 40 | 0 | 0 | 0 |
| 24.06.2022 06:00 - 07:00 | 0 | 0 | 0 | 0 |
| 24.06.2022 07:00 - 08:00 | 0 | 0 | 0 | 0 |
| 24.06.2022 08:00 - 09:00 | 20 | 0 | 0 | 0 |
| 24.06.2022 09:00 - 10:00 | 20 | 0 | 0 | 0 |
| 24.06.2022 10:00 - 11:00 | 20 | 0 | 0 | 0 |
| 24.06.2022 11:00 - 12:00 | 40 | 0 | 0 | 0 |
| 24.06.2022 12:00 - 13:00 | 40 | 0 | 0 | 0 |
| 24.06.2022 13:00 - 14:00 | 40 | 0 | 0 | 0 |
| 24.06.2022 14:00 - 15:00 | 40 | 0 | 0 | 0 |
| 24.06.2022 15:00 - 16:00 | 40 | 0 | 0 | 0 |
| 24.06.2022 16:00 - 17:00 | 40 | 0 | 0 | 0 |
| 24.06.2022 17:00 - 18:00 | 40 | 0 | 0 | 0 |
| 24.06.2022 18:00 - 19:00 | 40 | 0 | 0 | 0 |
| 24.06.2022 19:00 - 20:00 | 40 | 0 | 0 | 0 |
| 24.06.2022 20:00 - 21:00 | 40 | 0 | 0 | 0 |
| 24.06.2022 21:00 - 22:00 | 40 | 0 | 0 | 0 |
| 24.06.2022 22:00 - 23:00 | 40 | 0 | 0 | 0 |
| 24.06.2022 23:00 - 24:00 | 40 | 0 | 0 | 0 |
| 25.06.2022 00:00 - 01:00 | 40 | 0 | 0 | 0 |
| 25.06.2022 01:00 - 02:00 | 40 | 0 | 0 | 0 |
| 25.06.2022 02:00 - 03:00 | 40 | 0 | 0 | 0 |
| 25.06.2022 03:00 - 04:00 | 40 | 0 | 0 | 0 |
| 25.06.2022 04:00 - 05:00 | 40 | 0 | 0 | 0 |
| 25.06.2022 05:00 - 06:00 | 40 | 0 | 0 | 0 |
| 25.06.2022 06:00 - 07:00 | 0 | 0 | 0 | 0 |
| 25.06.2022 07:00 - 08:00 | 0 | 0 | 0 | 0 |
| 25.06.2022 08:00 - 09:00 | 0 | 0 | 0 | 0 |
| 25.06.2022 09:00 - 10:00 | 0 | 0 | 0 | 0 |
| 25.06.2022 10:00 - 11:00 | 0 | 0 | 0 | 0 |
| 25.06.2022 11:00 - 12:00 | 0 | 0 | 0 | 0 |
| 25.06.2022 12:00 - 13:00 | 0 | 0 | 0 | 0 |
| 25.06.2022 13:00 - 14:00 | 0 | 0 | 0 | 0 |
| 25.06.2022 14:00 - 15:00 | 0 | 0 | 0 | 0 |
| 25.06.2022 15:00 - 16:00 | 0 | 0 | 0 | 0 |
| 25.06.2022 16:00 - 17:00 | 0 | 0 | 0 | 0 |
| 25.06.2022 17:00 - 18:00 | 0 | 0 | 0 | 0 |
| 25.06.2022 18:00 - 19:00 | 0 | 0 | 0 | 0 |
| 25.06.2022 19:00 - 20:00 | 0 | 0 | 0 | 0 |
| 25.06.2022 20:00 - 21:00 | 0 | 0 | 0 | 0 |
| 25.06.2022 21:00 - 22:00 | 0 | 0 | 0 | 0 |
| 25.06.2022 22:00 - 23:00 | 0 | 0 | 0 | 0 |
| 25.06.2022 23:00 - 24:00 | 0 | 0 | 0 | 0 |
| 26.06.2022 00:00 - 01:00 | 0 | 0 | 0 | 0 |
| 26.06.2022 01:00 - 02:00 | 0 | 0 | 0 | 0 |
| 26.06.2022 02:00 - 03:00 | 0 | 0 | 0 | 0 |
| 26.06.2022 03:00 - 04:00 | 0 | 0 | 0 | 0 |
| 26.06.2022 04:00 - 05:00 | 0 | 0 | 0 | 0 |
| 26.06.2022 05:00 - 06:00 | 0 | 0 | 0 | 0 |
| 26.06.2022 06:00 - 07:00 | 0 | 0 | 0 | 0 |
| 26.06.2022 07:00 - 08:00 | 0 | 0 | 0 | 0 |
| 26.06.2022 08:00 - 09:00 | 0 | 0 | 0 | 0 |
| 26.06.2022 09:00 - 10:00 | 0 | 0 | 0 | 0 |
| 26.06.2022 10:00 - 11:00 | 0 | 0 | 0 | 0 |
| 26.06.2022 11:00 - 12:00 | 0 | 0 | 0 | 0 |
| 26.06.2022 12:00 - 13:00 | 0 | 0 | 0 | 0 |
| 26.06.2022 13:00 - 14:00 | 0 | 0 | 0 | 0 |
| 26.06.2022 14:00 - 15:00 | 0 | 0 | 0 | 0 |
| 26.06.2022 15:00 - 16:00 | 0 | 0 | 0 | 0 |
| 26.06.2022 16:00 - 17:00 | 0 | 0 | 0 | 0 |
| 26.06.2022 17:00 - 18:00 | 0 | 0 | 0 | 0 |
| 26.06.2022 18:00 - 19:00 | 0 | 0 | 0 | 0 |
| 26.06.2022 19:00 - 20:00 | 0 | 0 | 0 | 0 |
| 26.06.2022 20:00 - 21:00 | 0 | 0 | 0 | 0 |
| 26.06.2022 21:00 - 22:00 | 0 | 0 | 0 | 0 |
| 26.06.2022 22:00 - 23:00 | 0 | 0 | 0 | 0 |
| 26.06.2022 23:00 - 24:00 | 0 | 0 | 0 | 0 |
| 27.06.2022 00:00 - 01:00 | 0 | 0 | 0 | 0 |
| 27.06.2022 01:00 - 02:00 | 0 | 0 | 0 | 0 |
| 27.06.2022 02:00 - 03:00 | 0 | 0 | 0 | 0 |
| 27.06.2022 03:00 - 04:00 | 0 | 0 | 0 | 0 |
| 27.06.2022 04:00 - 05:00 | 0 | 0 | 0 | 0 |
| 27.06.2022 05:00 - 06:00 | 0 | 0 | 0 | 0 |
| 27.06.2022 06:00 - 07:00 | 0 | 0 | 0 | 0 |
| 27.06.2022 07:00 - 08:00 | 0 | 0 | 0 | 0 |
| 27.06.2022 08:00 - 09:00 | 0 | 0 | 0 | 0 |
| 27.06.2022 09:00 - 10:00 | 0 | 0 | 0 | 0 |
| 27.06.2022 10:00 - 11:00 | 0 | 0 | 0 | 0 |
| 27.06.2022 11:00 - 12:00 | 0 | 0 | 0 | 0 |
| 27.06.2022 12:00 - 13:00 | 0 | 0 | 0 | 0 |
| 27.06.2022 13:00 - 14:00 | 0 | 0 | 0 | 0 |
| 27.06.2022 14:00 - 15:00 | 0 | 0 | 0 | 0 |
| 27.06.2022 15:00 - 16:00 | 0 | 0 | 0 | 0 |
| 27.06.2022 16:00 - 17:00 | 0 | 0 | 0 | 0 |
| 27.06.2022 17:00 - 18:00 | 0 | 0 | 0 | 0 |
| 27.06.2022 18:00 - 19:00 | 0 | 0 | 0 | 0 |
| 27.06.2022 19:00 - 20:00 | 0 | 0 | 0 | 0 |
| 27.06.2022 20:00 - 21:00 | 0 | 0 | 0 | 0 |
| 27.06.2022 21:00 - 22:00 | 0 | 0 | 0 | 0 |
| 27.06.2022 22:00 - 23:00 | 0 | 0 | 0 | 0 |
| 27.06.2022 23:00 - 24:00 | 0 | 0 | 0 | 0 |
| 28.06.2022 00:00 - 01:00 | 0 | 0 | 0 | 0 |
| 28.06.2022 01:00 - 02:00 | 0 | 0 | 0 | 0 |
| 28.06.2022 02:00 - 03:00 | 0 | 0 | 0 | 0 |
| 28.06.2022 03:00 - 04:00 | 0 | 0 | 0 | 0 |
| 28.06.2022 04:00 - 05:00 | 0 | 0 | 0 | 0 |
| 28.06.2022 05:00 - 06:00 | 0 | 0 | 0 | 0 |
| 28.06.2022 06:00 - 07:00 | 0 | 0 | 0 | 0 |
| 28.06.2022 07:00 - 08:00 | 0 | 0 | 0 | 0 |
| 28.06.2022 08:00 - 09:00 | 0 | 0 | 0 | 0 |
| 28.06.2022 09:00 - 10:00 | 0 | 0 | 0 | 0 |
| 28.06.2022 10:00 - 11:00 | 0 | 0 | 0 | 0 |
| 28.06.2022 11:00 - 12:00 | 0 | 0 | 0 | 0 |
| 28.06.2022 12:00 - 13:00 | 0 | 0 | 0 | 0 |
| 28.06.2022 13:00 - 14:00 | 0 | 0 | 0 | 0 |
| 28.06.2022 14:00 - 15:00 | 0 | 0 | 0 | 0 |
| 28.06.2022 15:00 - 16:00 | 0 | 0 | 0 | 0 |
| 28.06.2022 16:00 - 17:00 | 0 | 0 | 0 | 0 |
| 28.06.2022 17:00 - 18:00 | 0 | 0 | 0 | 0 |
| 28.06.2022 18:00 - 19:00 | 0 | 0 | 0 | 0 |
| 28.06.2022 19:00 - 20:00 | 0 | 0 | 0 | 0 |
| 28.06.2022 20:00 - 21:00 | 0 | 0 | 0 | 0 |
| 28.06.2022 21:00 - 22:00 | 0 | 0 | 0 | 0 |
| 28.06.2022 22:00 - 23:00 | 0 | 0 | 0 | 0 |
| 28.06.2022 23:00 - 24:00 | 0 | 0 | 0 | 0 |
| 29.06.2022 00:00 - 01:00 | 0 | 0 | 0 | 0 |
| 29.06.2022 01:00 - 02:00 | 0 | 0 | 0 | 0 |
| 29.06.2022 02:00 - 03:00 | 0 | 0 | 0 | 0 |
| 29.06.2022 03:00 - 04:00 | 0 | 0 | 0 | 0 |
| 29.06.2022 04:00 - 05:00 | 0 | 0 | 0 | 0 |
| 29.06.2022 05:00 - 06:00 | 0 | 0 | 0 | 0 |
| 29.06.2022 06:00 - 07:00 | 0 | 0 | 0 | 0 |
| 29.06.2022 07:00 - 08:00 | 0 | 0 | 0 | 0 |
| 29.06.2022 08:00 - 09:00 | 0 | 0 | 0 | 0 |
| 29.06.2022 09:00 - 10:00 | 0 | 0 | 0 | 0 |
| 29.06.2022 10:00 - 11:00 | 0 | 0 | 0 | 0 |
| 29.06.2022 11:00 - 12:00 | 0 | 0 | 0 | 0 |
| 29.06.2022 12:00 - 13:00 | 0 | 0 | 0 | 0 |
| 29.06.2022 13:00 - 14:00 | 0 | 0 | 0 | 0 |
| 29.06.2022 14:00 - 15:00 | 0 | 0 | 0 | 0 |
| 29.06.2022 15:00 - 16:00 | 0 | 0 | 0 | 0 |
| 29.06.2022 16:00 - 17:00 | 0 | 0 | 0 | 0 |
| 29.06.2022 17:00 - 18:00 | 0 | 0 | 0 | 0 |
| 29.06.2022 18:00 - 19:00 | 0 | 0 | 0 | 0 |
| 29.06.2022 19:00 - 20:00 | 0 | 0 | 0 | 0 |
| 29.06.2022 20:00 - 21:00 | 0 | 0 | 0 | 0 |
| 29.06.2022 21:00 - 22:00 | 70 | 0 | 0 | 0 |
| 29.06.2022 22:00 - 23:00 | 70 | 0 | 0 | 0 |
| 29.06.2022 23:00 - 24:00 | 70 | 0 | 0 | 0 |
| 30.06.2022 00:00 - 01:00 | 150 | 0 | 0 | 0 |
| 30.06.2022 01:00 - 02:00 | 150 | 0 | 0 | 0 |
| 30.06.2022 02:00 - 03:00 | 150 | 0 | 0 | 0 |
| 30.06.2022 03:00 - 04:00 | 150 | 0 | 0 | 0 |
| 30.06.2022 04:00 - 05:00 | 150 | 0 | 0 | 0 |
| 30.06.2022 05:00 - 06:00 | 150 | 0 | 0 | 0 |
| 30.06.2022 06:00 - 07:00 | 0 | 0 | 0 | 0 |
| 30.06.2022 07:00 - 08:00 | 0 | 0 | 0 | 0 |
| 30.06.2022 08:00 - 09:00 | 0 | 0 | 0 | 0 |
| 30.06.2022 09:00 - 10:00 | 0 | 0 | 0 | 0 |
| 30.06.2022 10:00 - 11:00 | 0 | 0 | 0 | 0 |
| 30.06.2022 11:00 - 12:00 | 0 | 0 | 0 | 0 |
| 30.06.2022 12:00 - 13:00 | 0 | 0 | 0 | 0 |
| 30.06.2022 13:00 - 14:00 | 20 | 0 | 0 | 0 |
| 30.06.2022 14:00 - 15:00 | 20 | 0 | 0 | 0 |
| 30.06.2022 15:00 - 16:00 | 20 | 0 | 0 | 0 |
| 30.06.2022 16:00 - 17:00 | 20 | 0 | 0 | 0 |
| 30.06.2022 17:00 - 18:00 | 20 | 0 | 0 | 0 |
| 30.06.2022 18:00 - 19:00 | 20 | 0 | 0 | 0 |
| 30.06.2022 19:00 - 20:00 | 20 | 0 | 0 | 0 |
| 30.06.2022 20:00 - 21:00 | 20 | 0 | 0 | 0 |
| 30.06.2022 21:00 - 22:00 | 90 | 0 | 0 | 0 |
| 30.06.2022 22:00 - 23:00 | 90 | 0 | 0 | 0 |
| 30.06.2022 23:00 - 24:00 | 90 | 0 | 0 | 0 |
| 01.07.2022 00:00 - 01:00 | 90 | 0 | 0 | 0 |
| 01.07.2022 01:00 - 02:00 | 90 | 0 | 0 | 0 |
| 01.07.2022 02:00 - 03:00 | 140 | 0 | 0 | 0 |
| 01.07.2022 03:00 - 04:00 | 140 | 0 | 0 | 0 |
| 01.07.2022 04:00 - 05:00 | 140 | 0 | 0 | 0 |
| 01.07.2022 05:00 - 06:00 | 140 | 0 | 0 | 0 |